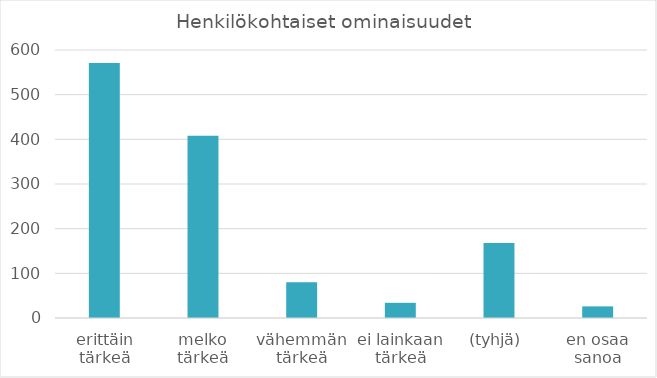
| Category | Summa |
|---|---|
| erittäin tärkeä | 571 |
| melko tärkeä | 408 |
| vähemmän tärkeä | 80 |
| ei lainkaan tärkeä | 34 |
| (tyhjä) | 168 |
| en osaa sanoa | 26 |